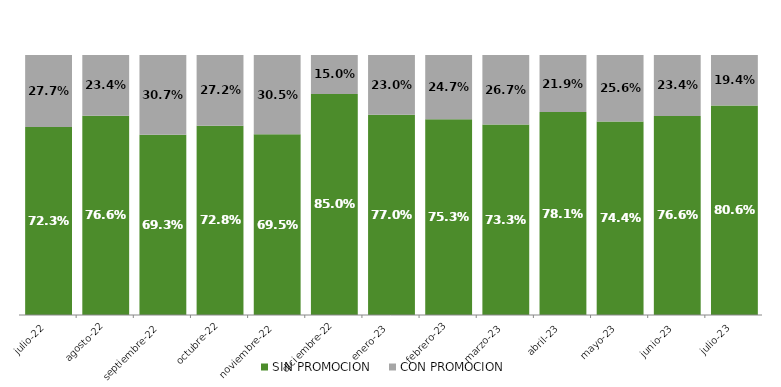
| Category | SIN PROMOCION   | CON PROMOCION   |
|---|---|---|
| 2022-07-01 | 0.723 | 0.277 |
| 2022-08-01 | 0.766 | 0.234 |
| 2022-09-01 | 0.693 | 0.307 |
| 2022-10-01 | 0.728 | 0.272 |
| 2022-11-01 | 0.695 | 0.305 |
| 2022-12-01 | 0.85 | 0.15 |
| 2023-01-01 | 0.77 | 0.23 |
| 2023-02-01 | 0.753 | 0.247 |
| 2023-03-01 | 0.733 | 0.267 |
| 2023-04-01 | 0.781 | 0.219 |
| 2023-05-01 | 0.744 | 0.256 |
| 2023-06-01 | 0.766 | 0.234 |
| 2023-07-01 | 0.806 | 0.194 |